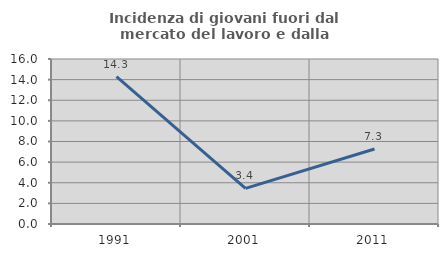
| Category | Incidenza di giovani fuori dal mercato del lavoro e dalla formazione  |
|---|---|
| 1991.0 | 14.286 |
| 2001.0 | 3.448 |
| 2011.0 | 7.273 |